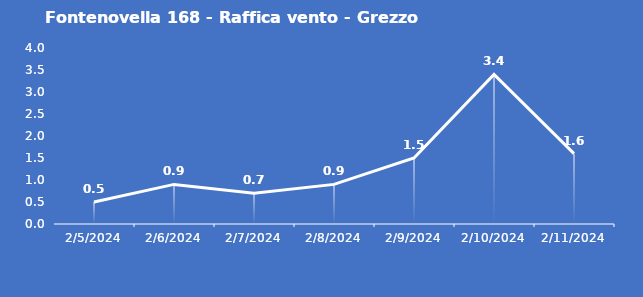
| Category | Fontenovella 168 - Raffica vento - Grezzo (m/s) |
|---|---|
| 2/5/24 | 0.5 |
| 2/6/24 | 0.9 |
| 2/7/24 | 0.7 |
| 2/8/24 | 0.9 |
| 2/9/24 | 1.5 |
| 2/10/24 | 3.4 |
| 2/11/24 | 1.6 |